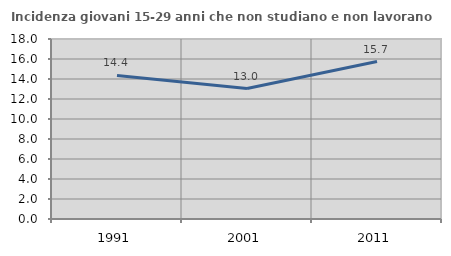
| Category | Incidenza giovani 15-29 anni che non studiano e non lavorano  |
|---|---|
| 1991.0 | 14.362 |
| 2001.0 | 13.043 |
| 2011.0 | 15.748 |